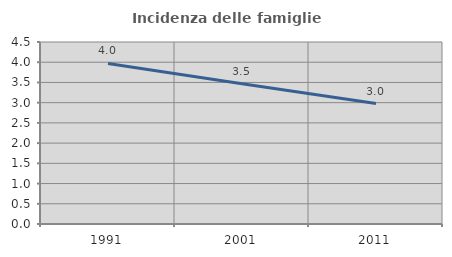
| Category | Incidenza delle famiglie numerose |
|---|---|
| 1991.0 | 3.969 |
| 2001.0 | 3.47 |
| 2011.0 | 2.978 |